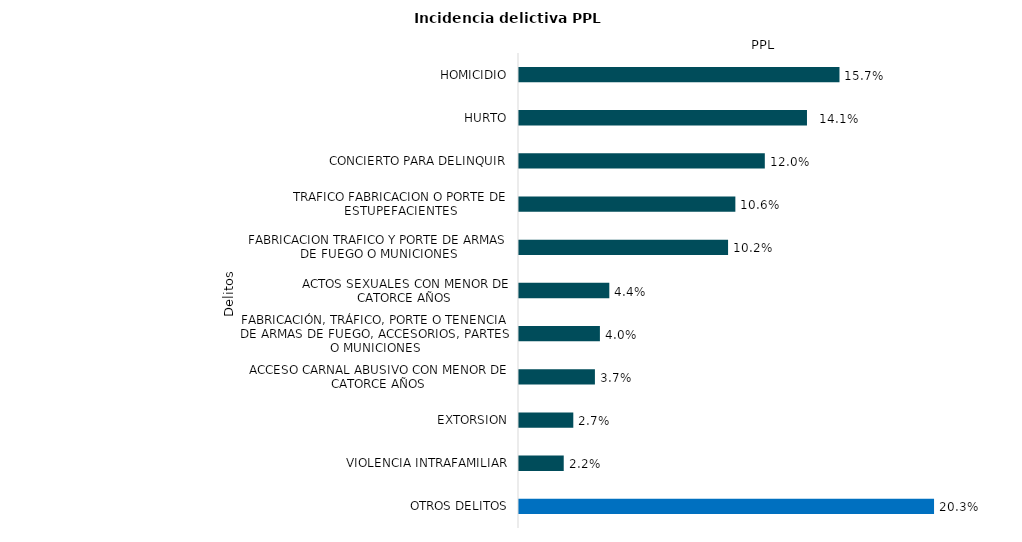
| Category | Total |
|---|---|
| HOMICIDIO | 25950 |
| HURTO | 23318 |
| CONCIERTO PARA DELINQUIR | 19904 |
| TRAFICO FABRICACION O PORTE DE ESTUPEFACIENTES | 17519 |
| FABRICACION TRAFICO Y PORTE DE ARMAS DE FUEGO O MUNICIONES | 16929 |
| ACTOS SEXUALES CON MENOR DE CATORCE AÑOS | 7313 |
| FABRICACIÓN, TRÁFICO, PORTE O TENENCIA DE ARMAS DE FUEGO, ACCESORIOS, PARTES O MUNICIONES | 6551 |
| ACCESO CARNAL ABUSIVO CON MENOR DE CATORCE AÑOS | 6147 |
| EXTORSION | 4397 |
| VIOLENCIA INTRAFAMILIAR | 3622 |
| OTROS DELITOS | 33607 |